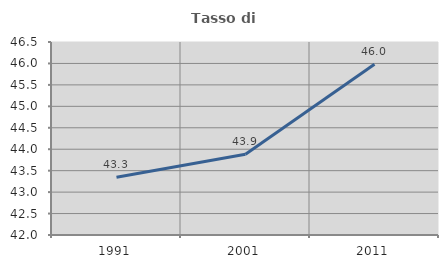
| Category | Tasso di occupazione   |
|---|---|
| 1991.0 | 43.349 |
| 2001.0 | 43.883 |
| 2011.0 | 45.982 |